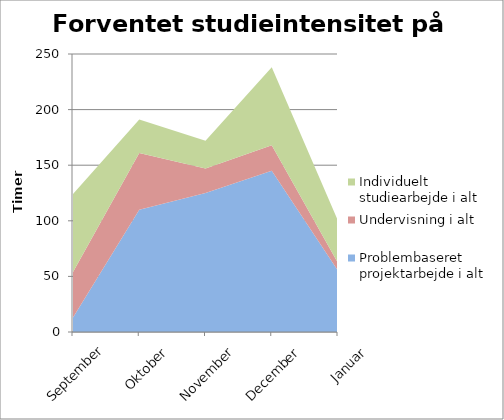
| Category | Problembaseret projektarbejde i alt | Undervisning i alt | Individuelt studiearbejde i alt |
|---|---|---|---|
| September | 13 | 41 | 70 |
| Oktober | 110 | 51 | 30 |
| November | 125 | 22 | 25 |
| December | 145 | 23 | 70 |
| Januar | 55 | 7 | 38 |